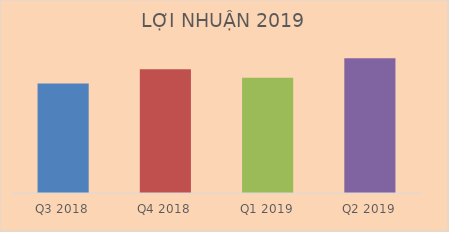
| Category | Doanh thu thuần |
|---|---|
| Q3 2018 | 100927240103 |
| Q4 2018 | 114038861577 |
| Q1 2019 | 106063380622 |
| Q2 2019 | 124134857575 |